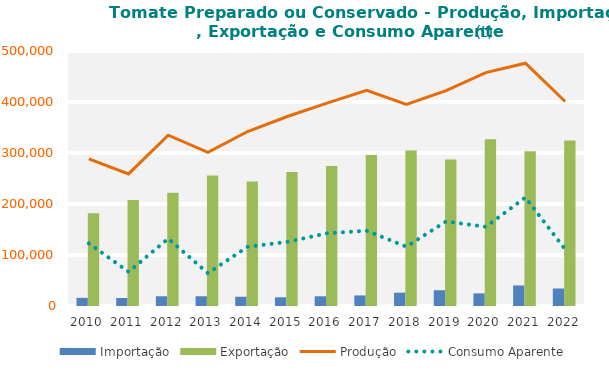
| Category | Importação | Exportação |
|---|---|---|
| 0 | 15995.002 | 181723.808 |
| 1 | 15709.029 | 207647.919 |
| 2 | 19088.919 | 221908.627 |
| 3 | 19105.494 | 255935.505 |
| 4 | 18148.001 | 244144.071 |
| 5 | 17124.907 | 262939.21 |
| 6 | 19060.279 | 274304.677 |
| 7 | 20707.104 | 296267.492 |
| 8 | 26136.468 | 305054.678 |
| 9 | 30951.837 | 287333.27 |
| 10 | 24737.543 | 327081.657 |
| 11 | 40266.095 | 303412.631 |
| 12 | 34300.256 | 324296.201 |